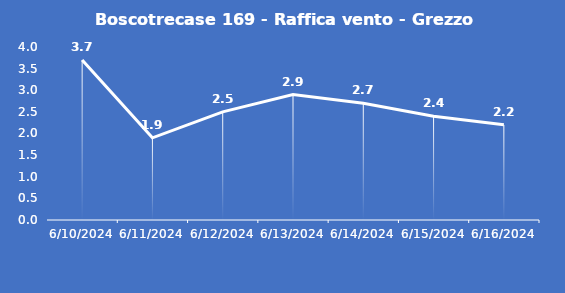
| Category | Boscotrecase 169 - Raffica vento - Grezzo (m/s) |
|---|---|
| 6/10/24 | 3.7 |
| 6/11/24 | 1.9 |
| 6/12/24 | 2.5 |
| 6/13/24 | 2.9 |
| 6/14/24 | 2.7 |
| 6/15/24 | 2.4 |
| 6/16/24 | 2.2 |